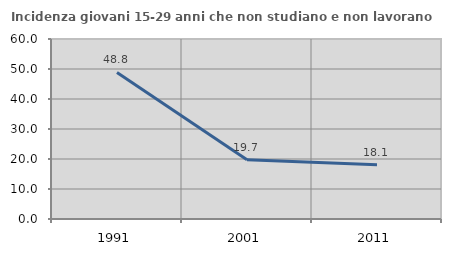
| Category | Incidenza giovani 15-29 anni che non studiano e non lavorano  |
|---|---|
| 1991.0 | 48.837 |
| 2001.0 | 19.722 |
| 2011.0 | 18.065 |